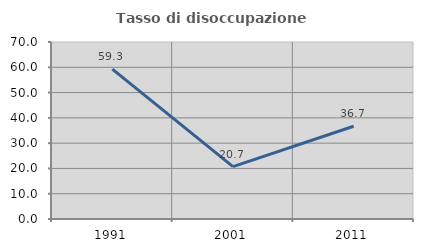
| Category | Tasso di disoccupazione giovanile  |
|---|---|
| 1991.0 | 59.302 |
| 2001.0 | 20.69 |
| 2011.0 | 36.667 |